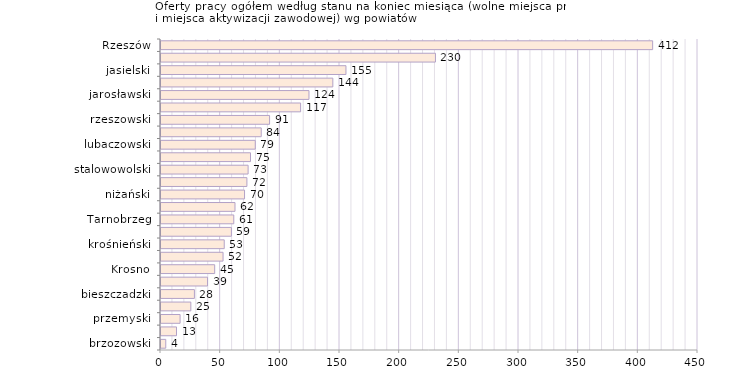
| Category | Oferty pracy ogółem według stanu na koniec miesiąca (wolne miejsca pracy i miejsca aktywizacji zawodowej) wg powiatów |
|---|---|
| brzozowski | 4 |
| leski | 13 |
| przemyski | 16 |
| Przemyśl | 25 |
| bieszczadzki | 28 |
| łańcucki | 39 |
| Krosno | 45 |
| kolbuszowski | 52 |
| krośnieński | 53 |
| ropczycko-sędziszowski | 59 |
| Tarnobrzeg | 61 |
| leżajski | 62 |
| niżański | 70 |
| tarnobrzeski  | 72 |
| stalowowolski | 73 |
| sanocki | 75 |
| lubaczowski | 79 |
| strzyżowski | 84 |
| rzeszowski | 91 |
| dębicki | 117 |
| jarosławski | 124 |
| przeworski | 144 |
| jasielski | 155 |
| mielecki | 230 |
| Rzeszów | 412 |